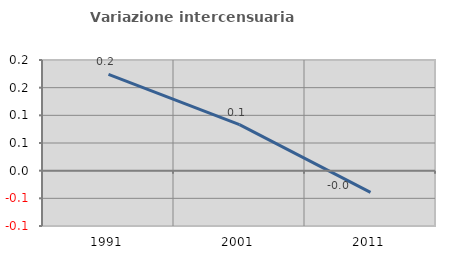
| Category | Variazione intercensuaria annua |
|---|---|
| 1991.0 | 0.174 |
| 2001.0 | 0.083 |
| 2011.0 | -0.039 |